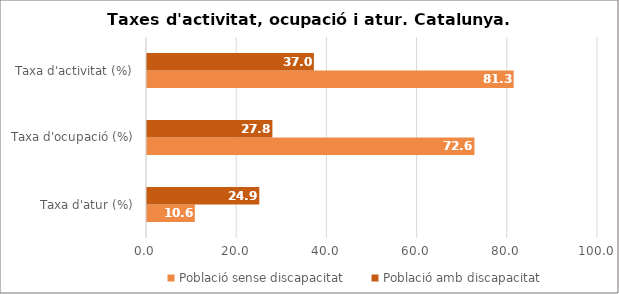
| Category | Població sense discapacitat | Població amb discapacitat |
|---|---|---|
| Taxa d'atur (%) | 10.6 | 24.9 |
| Taxa d'ocupació (%) | 72.6 | 27.8 |
| Taxa d'activitat (%) | 81.3 | 37 |